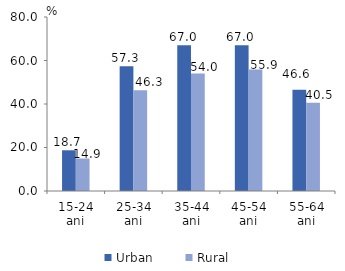
| Category | Urban | Rural |
|---|---|---|
| 15-24 ani | 18.723 | 14.939 |
| 25-34 ani | 57.318 | 46.273 |
| 35-44 ani | 67.033 | 53.988 |
| 45-54 ani | 66.972 | 55.853 |
| 55-64 ani | 46.598 | 40.526 |